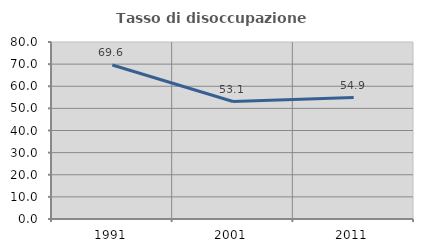
| Category | Tasso di disoccupazione giovanile  |
|---|---|
| 1991.0 | 69.624 |
| 2001.0 | 53.107 |
| 2011.0 | 54.887 |